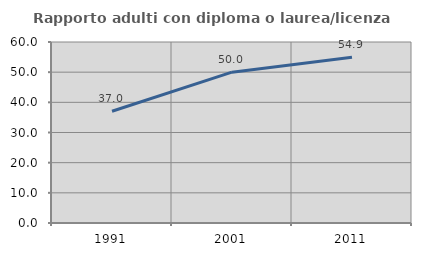
| Category | Rapporto adulti con diploma o laurea/licenza media  |
|---|---|
| 1991.0 | 37.037 |
| 2001.0 | 50 |
| 2011.0 | 54.945 |